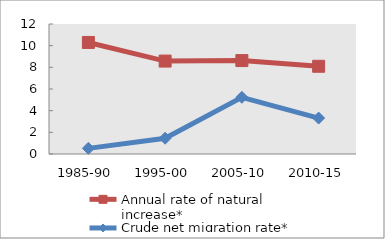
| Category | Annual rate of natural increase* | Crude net migration rate* |
|---|---|---|
| 1985-90 | 10.296 | 0.521 |
| 1995-00 | 8.578 | 1.454 |
| 2005-10 | 8.625 | 5.232 |
| 2010-15 | 8.098 | 3.317 |